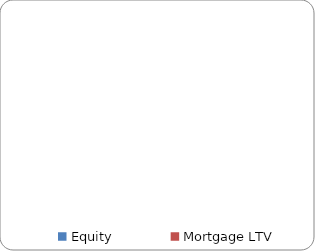
| Category | Series 0 | Series 1 |
|---|---|---|
| Equity | 0.365 |  |
| Mortgage LTV | 0.635 |  |